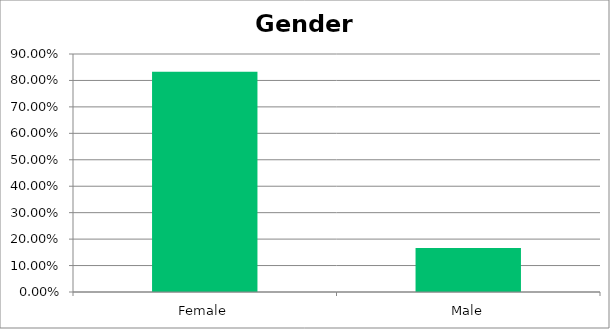
| Category | Responses |
|---|---|
| Female | 0.833 |
| Male | 0.167 |